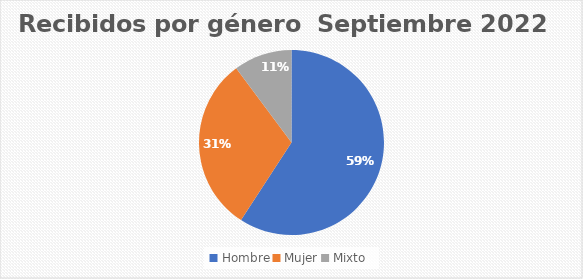
| Category | Recibidos por género  Septiembre |
|---|---|
| Hombre | 29 |
| Mujer | 15 |
| Mixto | 5 |